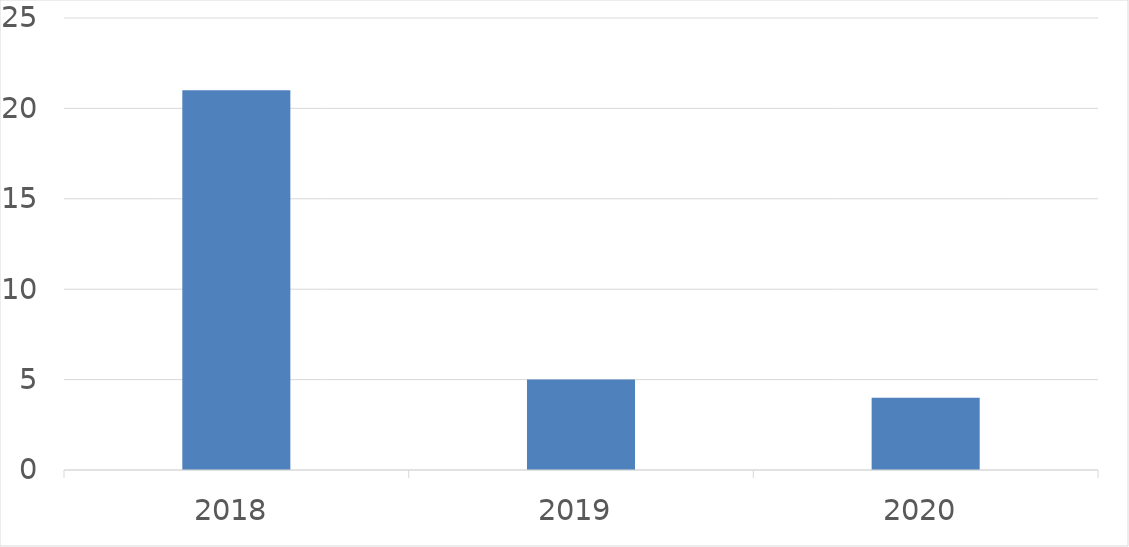
| Category | Series 0 |
|---|---|
| 2018 | 21 |
| 2019 | 5 |
| 2020 | 4 |